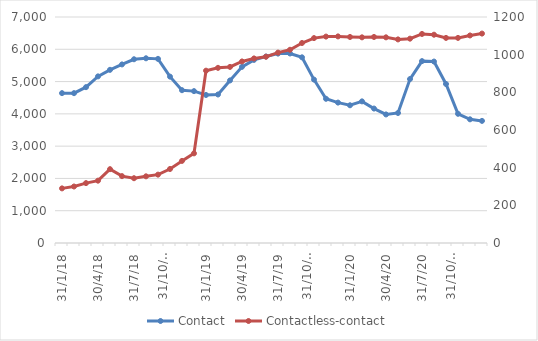
| Category | Contact |
|---|---|
| 31/1/18 | 4642 |
| 28/2/18 | 4641 |
| 31/3/18 | 4827 |
| 30/4/18 | 5161 |
| 31/5/18 | 5364 |
| 30/6/18 | 5531 |
| 31/7/18 | 5691 |
| 31/8/18 | 5721 |
| 30/9/18 | 5703 |
| 31/10/18 | 5153 |
| 30/11/18 | 4733 |
| 31/12/18 | 4704 |
| 31/1/19 | 4585 |
| 28/2/19 | 4600 |
| 31/3/19 | 5035 |
| 30/4/19 | 5456 |
| 31/5/19 | 5672 |
| 30/6/19 | 5777 |
| 31/7/19 | 5866 |
| 31/8/19 | 5870 |
| 30/9/19 | 5751 |
| 31/10/19 | 5061 |
| 30/11/19 | 4467 |
| 31/12/19 | 4349 |
| 31/1/20 | 4266 |
| 29/2/20 | 4387 |
| 31/3/20 | 4164 |
| 30/4/20 | 3982 |
| 31/5/20 | 4027 |
| 30/6/20 | 5078 |
| 31/7/20 | 5634 |
| 31/8/20 | 5620 |
| 30/9/20 | 4925 |
| 31/10/20 | 4002 |
| 30/11/20 | 3831 |
| 31/12/20 | 3782 |